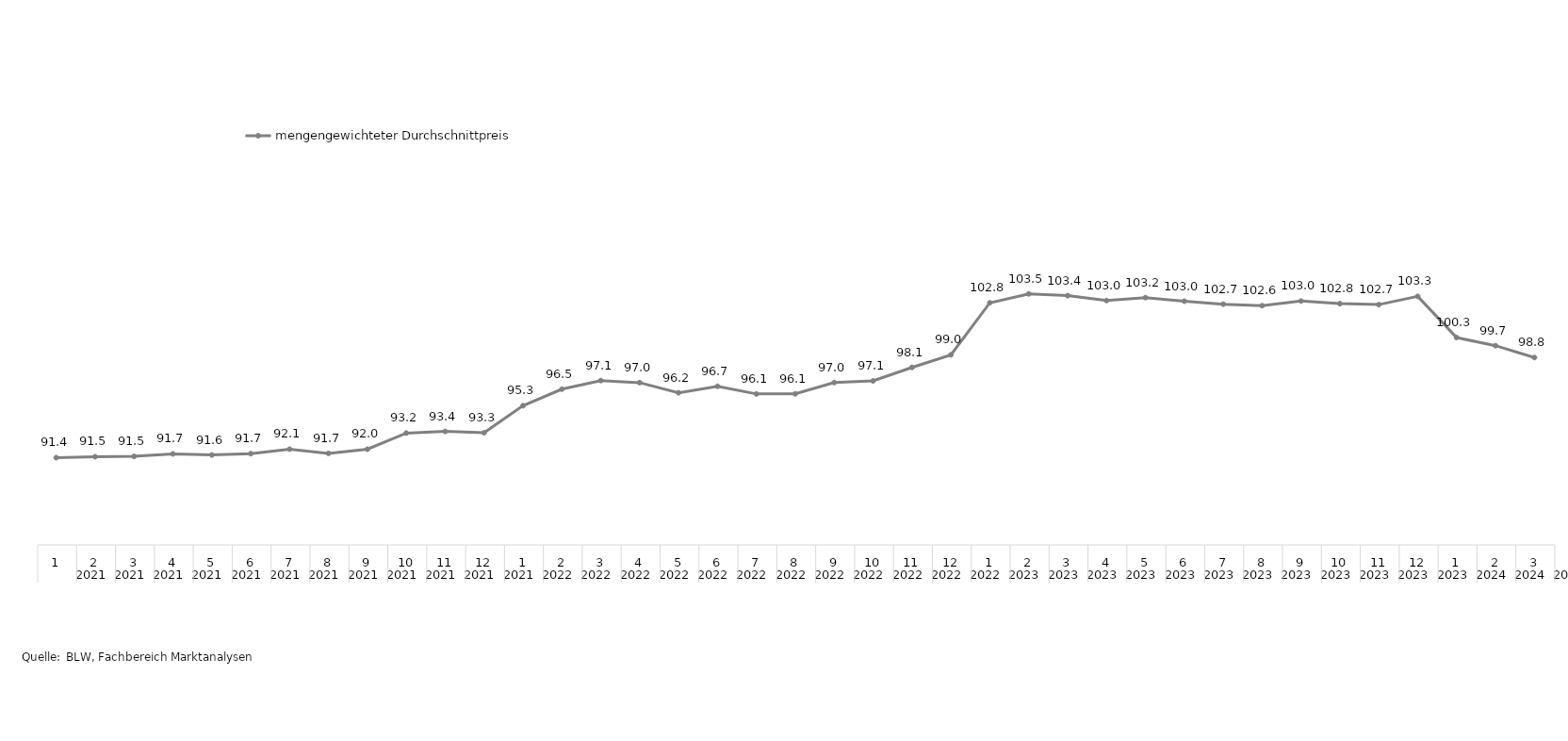
| Category | mengengewichteter Durchschnittpreis  |
|---|---|
| 0 | 98.804 |
| 1 | 99.675 |
| 2 | 100.274 |
| 3 | 103.308 |
| 4 | 102.7 |
| 5 | 102.77 |
| 6 | 102.962 |
| 7 | 102.621 |
| 8 | 102.733 |
| 9 | 102.951 |
| 10 | 103.216 |
| 11 | 103 |
| 12 | 103.363 |
| 13 | 103.494 |
| 14 | 102.832 |
| 15 | 99.003 |
| 16 | 98.076 |
| 17 | 97.082 |
| 18 | 96.959 |
| 19 | 96.128 |
| 20 | 96.12 |
| 21 | 96.686 |
| 22 | 96.206 |
| 23 | 96.953 |
| 24 | 97.105 |
| 25 | 96.474 |
| 26 | 95.257 |
| 27 | 93.263 |
| 28 | 93.361 |
| 29 | 93.238 |
| 30 | 92.049 |
| 31 | 91.744 |
| 32 | 92.053 |
| 33 | 91.722 |
| 34 | 91.624 |
| 35 | 91.705 |
| 36 | 91.521 |
| 37 | 91.497 |
| 38 | 91.425 |